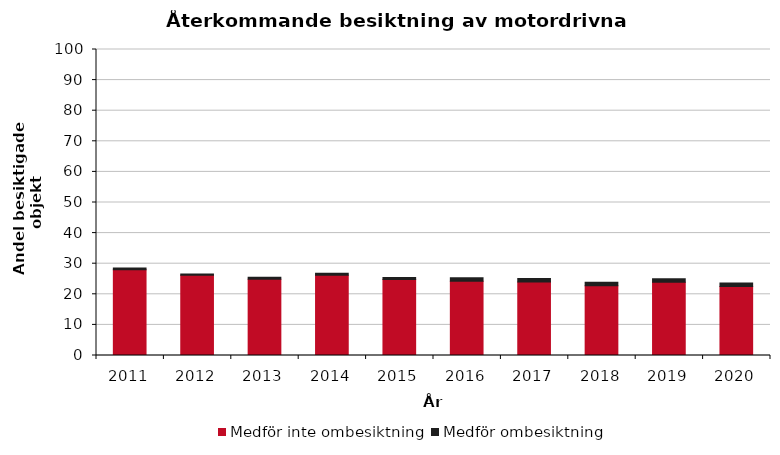
| Category | Medför inte ombesiktning | Medför ombesiktning |
|---|---|---|
| 2011.0 | 28 | 0.6 |
| 2012.0 | 26.2 | 0.4 |
| 2013.0 | 24.9 | 0.7 |
| 2014.0 | 26.2 | 0.7 |
| 2015.0 | 24.8 | 0.7 |
| 2016.0 | 24.3 | 1.1 |
| 2017.0 | 24 | 1.2 |
| 2018.0 | 22.8 | 1.1 |
| 2019.0 | 23.9 | 1.2 |
| 2020.0 | 22.547 | 1.153 |